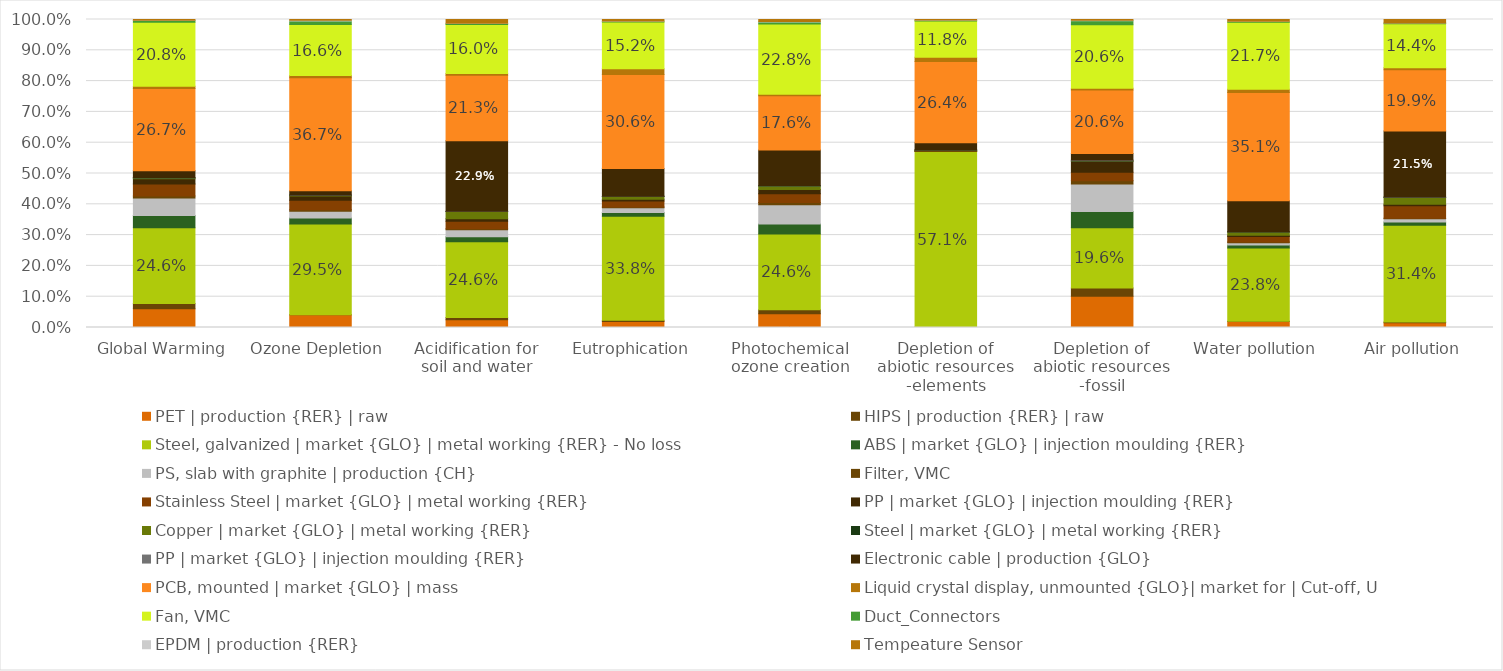
| Category | PET | production {RER} | raw | HIPS | production {RER} | raw | Steel, galvanized | market {GLO} | metal working {RER} - No loss | ABS | market {GLO} | injection moulding {RER} | PS, slab with graphite | production {CH} | Filter, VMC | Stainless Steel | market {GLO} | metal working {RER} | PP | market {GLO} | injection moulding {RER} | Copper | market {GLO} | metal working {RER} | Steel | market {GLO} | metal working {RER} | Electronic cable | production {GLO} | PCB, mounted | market {GLO} | mass | Liquid crystal display, unmounted {GLO}| market for | Cut-off, U | Fan, VMC | Duct_Connectors | EPDM | production {RER} | Tempeature Sensor |
|---|---|---|---|---|---|---|---|---|---|---|---|---|---|---|---|---|---|
| Global Warming | 0.061 | 0.017 | 0.246 | 0.04 | 0.056 | 0.007 | 0.039 | 0.001 | 0.002 | 0.001 | 0.022 | 0.267 | 0.007 | 0.208 | 0.006 | 0.001 | 0.002 |
| Ozone Depletion | 0.041 | 0 | 0.295 | 0.02 | 0.021 | 0.005 | 0.031 | 0.001 | 0.002 | 0.001 | 0.014 | 0.367 | 0.007 | 0.166 | 0.011 | 0.002 | 0.003 |
| Acidification for soil and water | 0.025 | 0.008 | 0.246 | 0.016 | 0.023 | 0.003 | 0.024 | 0 | 0.024 | 0 | 0.229 | 0.213 | 0.005 | 0.16 | 0.003 | 0 | 0.012 |
| Eutrophication | 0.02 | 0.004 | 0.338 | 0.012 | 0.015 | 0.003 | 0.019 | 0 | 0.009 | 0.001 | 0.09 | 0.306 | 0.018 | 0.152 | 0.002 | 0 | 0.005 |
| Photochemical ozone creation | 0.044 | 0.013 | 0.246 | 0.032 | 0.063 | 0.008 | 0.028 | 0.001 | 0.011 | 0.001 | 0.115 | 0.176 | 0.006 | 0.228 | 0.006 | 0.001 | 0.007 |
| Depletion of abiotic resources -elements | 0 | 0 | 0.571 | 0 | 0 | 0 | 0.002 | 0 | 0.002 | 0 | 0.023 | 0.264 | 0.014 | 0.118 | 0.002 | 0.001 | 0.002 |
| Depletion of abiotic resources -fossil | 0.101 | 0.027 | 0.196 | 0.053 | 0.089 | 0.01 | 0.028 | 0.002 | 0.001 | 0.001 | 0.022 | 0.206 | 0.006 | 0.206 | 0.013 | 0.002 | 0.003 |
| Water pollution | 0.02 | 0.001 | 0.238 | 0.01 | 0.007 | 0.002 | 0.017 | 0 | 0.01 | 0.001 | 0.101 | 0.351 | 0.011 | 0.217 | 0.003 | 0.001 | 0.006 |
| Air pollution | 0.015 | 0.003 | 0.314 | 0.011 | 0.01 | 0.002 | 0.04 | 0 | 0.022 | 0.001 | 0.215 | 0.199 | 0.006 | 0.144 | 0.002 | 0 | 0.011 |